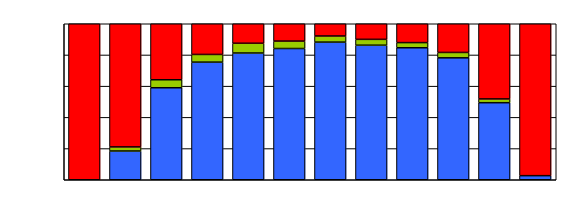
| Category | Series 0 | Series 1 | Series 2 |
|---|---|---|---|
| 0 | 0 | 0 | 130 |
| 1 | 7 | 1 | 30 |
| 2 | 23 | 2 | 14 |
| 3 | 46 | 3 | 12 |
| 4 | 52 | 4 | 8 |
| 5 | 53 | 3 | 7 |
| 6 | 45 | 2 | 4 |
| 7 | 69 | 3 | 8 |
| 8 | 77 | 3 | 11 |
| 9 | 68 | 3 | 16 |
| 10 | 41 | 2 | 40 |
| 11 | 8 | 0 | 297 |